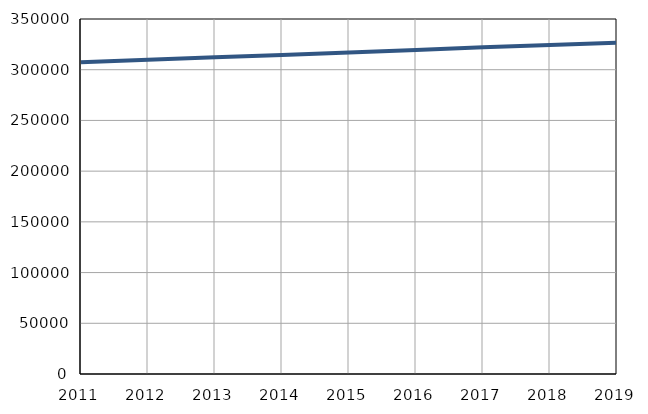
| Category | Population
size |
|---|---|
| 2011.0 | 307426 |
| 2012.0 | 309762 |
| 2013.0 | 312247 |
| 2014.0 | 314620 |
| 2015.0 | 316942 |
| 2016.0 | 319484 |
| 2017.0 | 322071 |
| 2018.0 | 324422 |
| 2019.0 | 326644 |